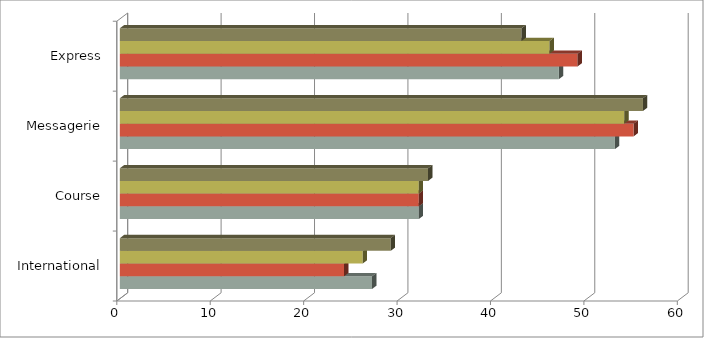
| Category | TRIM.1 | TRIM.2 | TRIM.3 | TRIM.4 |
|---|---|---|---|---|
| International | 27 | 24 | 26 | 29 |
| Course | 32 | 32 | 32 | 33 |
| Messagerie | 53 | 55 | 54 | 56 |
| Express | 47 | 49 | 46 | 43 |